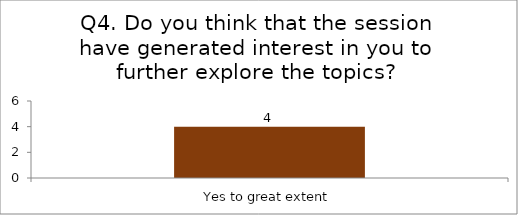
| Category | Q4. Do you think that the session have generated interest in you to further explore the topics? |
|---|---|
| Yes to great extent | 4 |